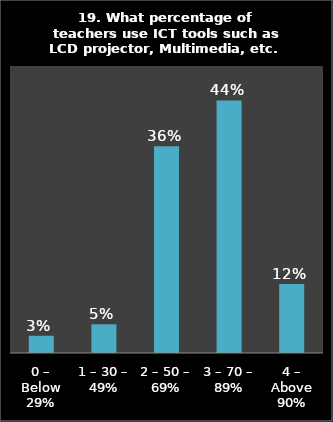
| Category | Series 0 |
|---|---|
| 0 – Below 29% | 0.03 |
| 1 – 30 – 49% | 0.05 |
| 2 – 50 – 69% | 0.36 |
| 3 – 70 – 89% | 0.44 |
| 4 – Above 90% | 0.12 |